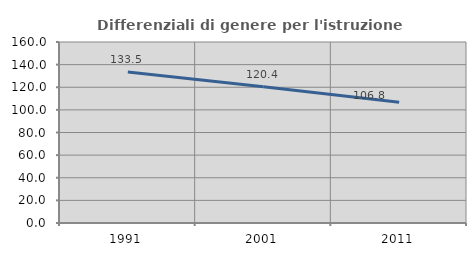
| Category | Differenziali di genere per l'istruzione superiore |
|---|---|
| 1991.0 | 133.46 |
| 2001.0 | 120.364 |
| 2011.0 | 106.781 |